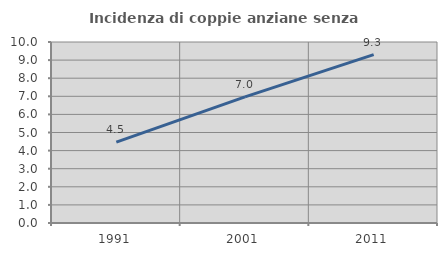
| Category | Incidenza di coppie anziane senza figli  |
|---|---|
| 1991.0 | 4.471 |
| 2001.0 | 6.971 |
| 2011.0 | 9.301 |